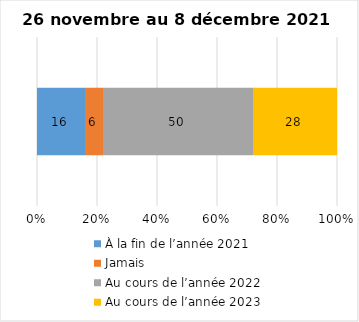
| Category | À la fin de l’année 2021 | Jamais | Au cours de l’année 2022 | Au cours de l’année 2023 |
|---|---|---|---|---|
| 0 | 16 | 6 | 50 | 28 |